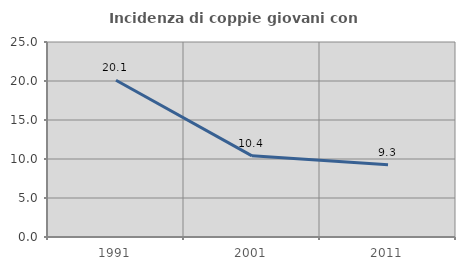
| Category | Incidenza di coppie giovani con figli |
|---|---|
| 1991.0 | 20.094 |
| 2001.0 | 10.405 |
| 2011.0 | 9.263 |